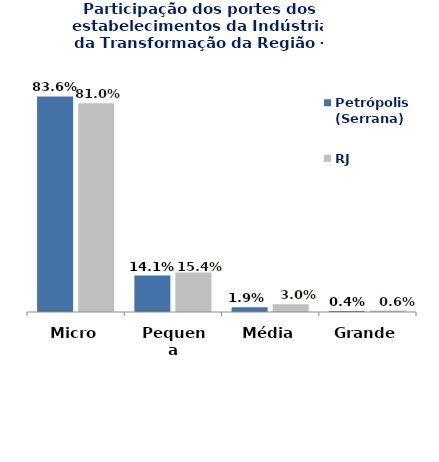
| Category | Petrópolis (Serrana) | RJ |
|---|---|---|
| Micro | 0.836 | 0.81 |
| Pequena | 0.141 | 0.154 |
| Média | 0.019 | 0.03 |
| Grande | 0.004 | 0.006 |